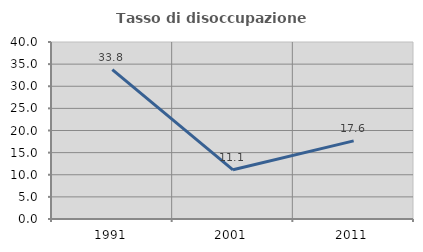
| Category | Tasso di disoccupazione giovanile  |
|---|---|
| 1991.0 | 33.766 |
| 2001.0 | 11.111 |
| 2011.0 | 17.647 |